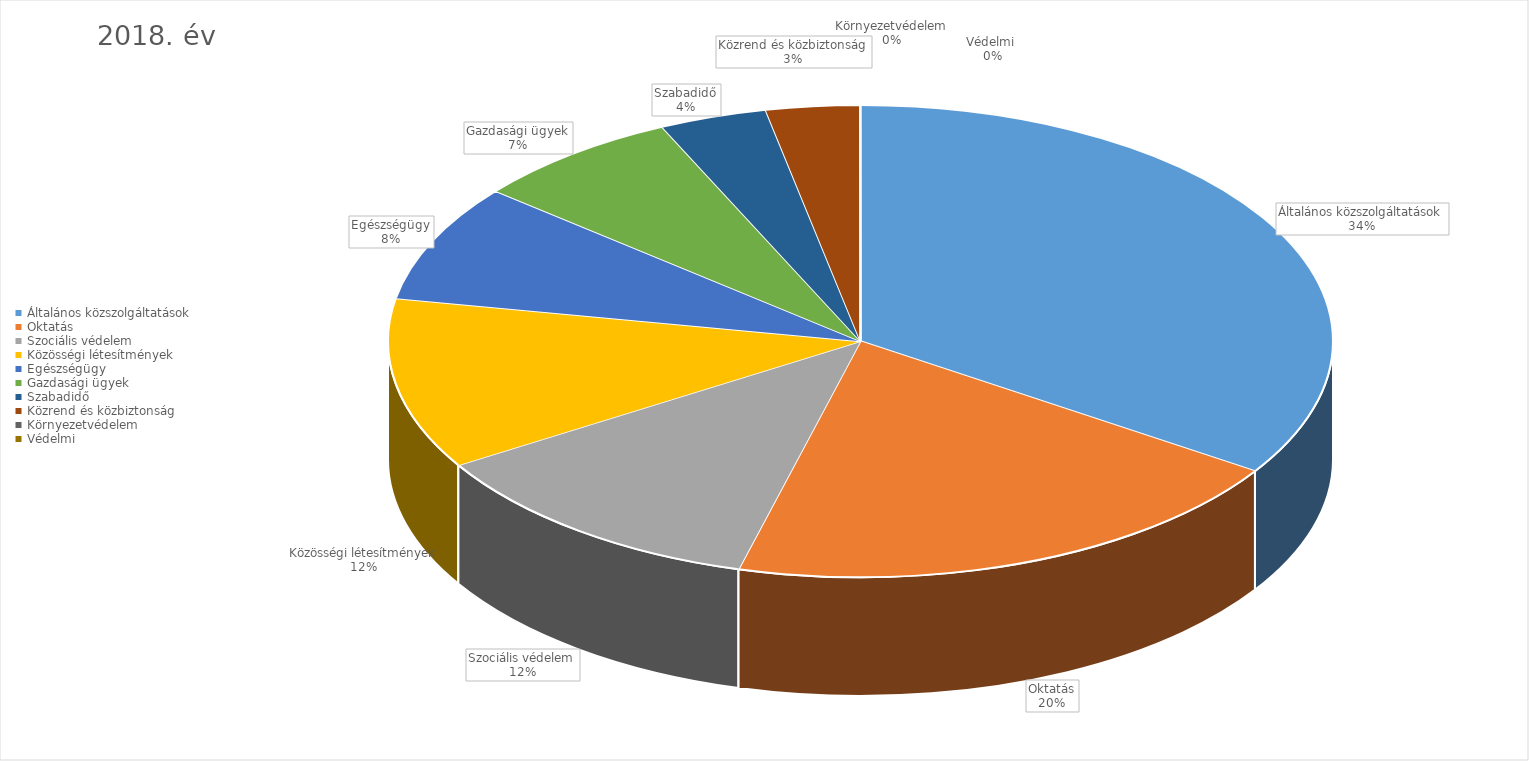
| Category | 2018. év |
|---|---|
| Általános közszolgáltatások | 10187464082 |
| Oktatás | 5905825500 |
| Szociális védelem | 3579929600 |
| Közösségi létesítmények | 3478294054 |
| Egészségügy | 2395275486 |
| Gazdasági ügyek | 2120133501 |
| Szabadidő | 1093743164 |
| Közrend és közbiztonság | 954370373 |
| Környezetvédelem | 0 |
| Védelmi  | 2400000 |